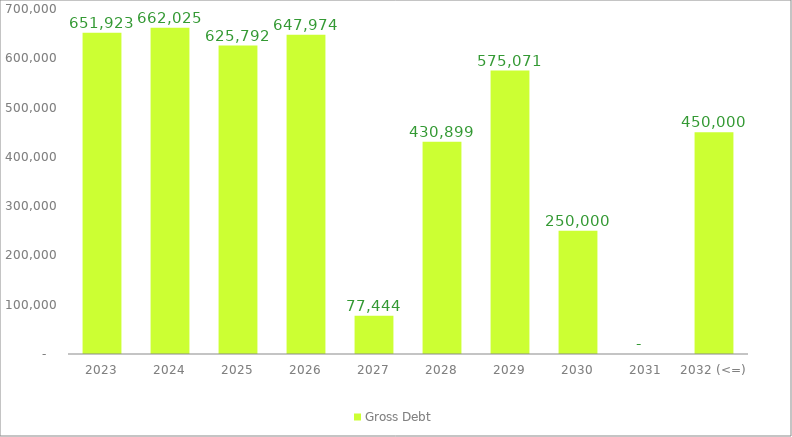
| Category | Gross Debt |
|---|---|
| 2023 | 651923.414 |
| 2024 | 662025.271 |
| 2025 | 625791.857 |
| 2026 | 647973.697 |
| 2027 | 77444.022 |
| 2028 | 430899.316 |
| 2029 | 575071 |
| 2030 | 250000 |
| 2031 | 0 |
| 2032 (<=) | 450000 |